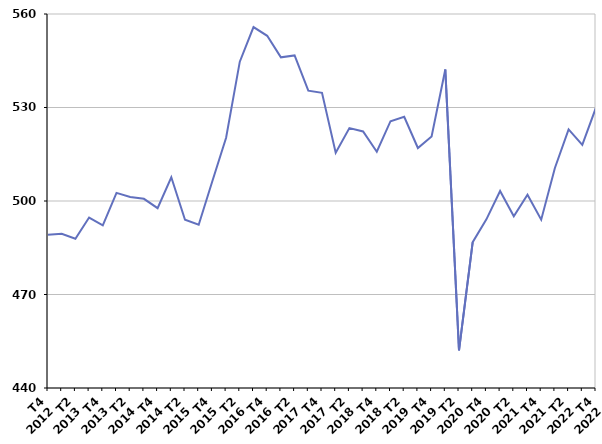
| Category | Ensemble des entrées en catégories A, B, C |
|---|---|
| T4
2012 | 489.2 |
| T1
2013 | 489.5 |
| T2
2013 | 487.9 |
| T3
2013 | 494.7 |
| T4
2013 | 492.2 |
| T1
2014 | 502.6 |
| T2
2014 | 501.3 |
| T3
2014 | 500.7 |
| T4
2014 | 497.7 |
| T1
2015 | 507.6 |
| T2
2015 | 494 |
| T3
2015 | 492.4 |
| T4
2015 | 506.4 |
| T1
2016 | 520.3 |
| T2
2016 | 544.7 |
| T3
2016 | 555.8 |
| T4
2016 | 553 |
| T1
2017 | 546.1 |
| T2
2017 | 546.7 |
| T3
2017 | 535.4 |
| T4
2017 | 534.7 |
| T1
2018 | 515.5 |
| T2
2018 | 523.4 |
| T3
2018 | 522.3 |
| T4
2018 | 515.8 |
| T1
2019 | 525.6 |
| T2
2019 | 527 |
| T3
2019 | 517 |
| T4
2019 | 520.7 |
| T1
2020 | 542.2 |
| T2
2020 | 452.1 |
| T3
2020 | 486.8 |
| T4
2020 | 494.1 |
| T1
2021 | 503.2 |
| T2
2021 | 495.1 |
| T3
2021 | 502 |
| T4
2021 | 494 |
| T1
2022 | 510.6 |
| T2
2022 | 523 |
| T3
2022 | 518 |
| T4
2022 | 530 |